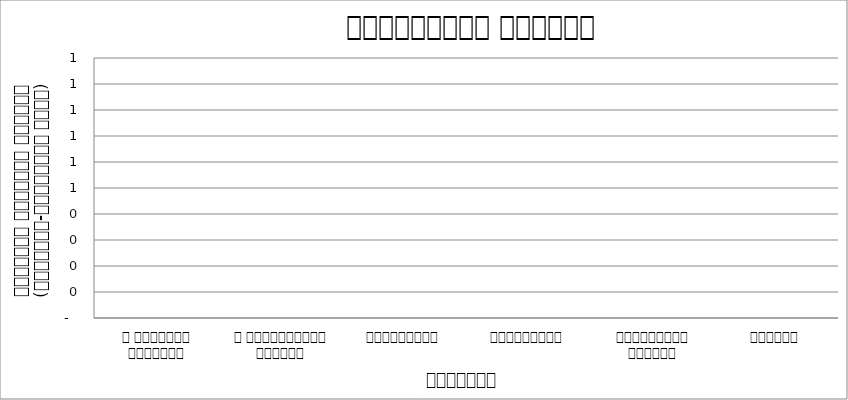
| Category | प्राकृतिक प्रकोप |
|---|---|
| द हिमालयन टाइम्स् | 0 |
| द काठमाण्डौं पोस्ट् | 0 |
| रिपब्लिका | 0 |
| कान्तिपुर | 0 |
| अन्नपूर्ण पोस्ट् | 0 |
| नागरिक | 0 |